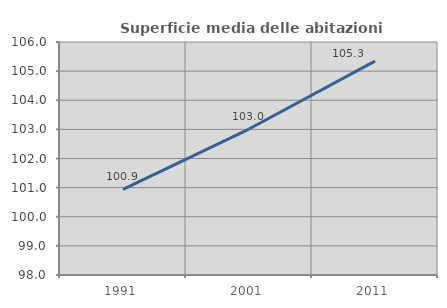
| Category | Superficie media delle abitazioni occupate |
|---|---|
| 1991.0 | 100.942 |
| 2001.0 | 103.011 |
| 2011.0 | 105.342 |